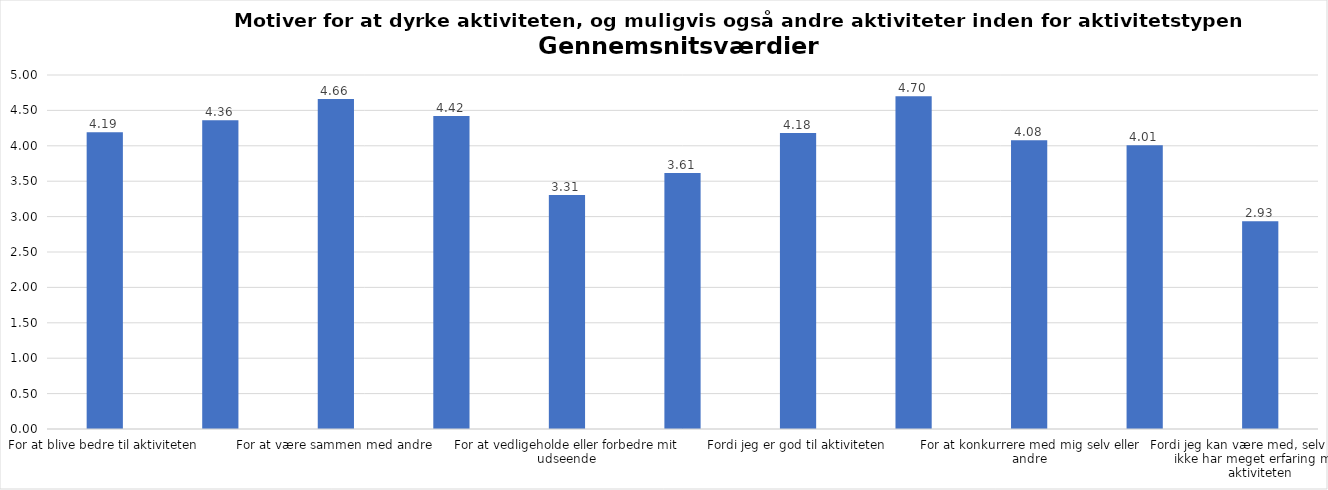
| Category | Gennemsnit |
|---|---|
| For at blive bedre til aktiviteten | 4.192 |
| For at vedligeholde eller forbedre min sundhed (fx helbred, fysisk form) | 4.359 |
| For at være sammen med andre | 4.661 |
| For at gøre noget godt for mig selv | 4.42 |
| For at vedligeholde eller forbedre mit udseende | 3.305 |
| Fordi andre i min omgangskreds opmuntrer mig til det | 3.615 |
| Fordi jeg er god til aktiviteten | 4.18 |
| Fordi jeg godt kan lide aktiviteten | 4.702 |
| For at konkurrere med mig selv eller andre | 4.079 |
| Fordi aktiviteten passer godt ind i min hverdag | 4.009 |
| Fordi jeg kan være med, selv om jeg ikke har meget erfaring med aktiviteten | 2.933 |